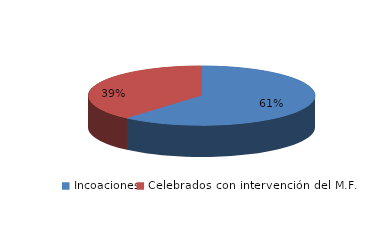
| Category | Series 0 |
|---|---|
| Incoaciones | 4902 |
| Celebrados con intervención del M.F. | 3086 |